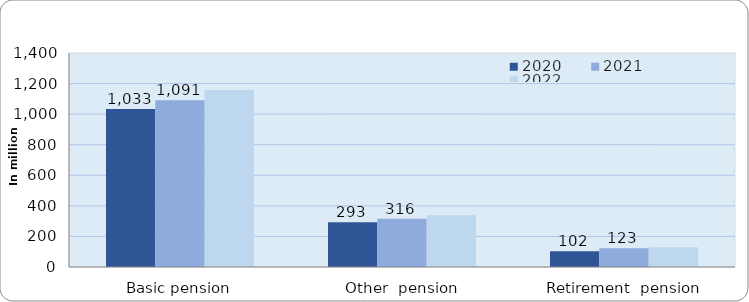
| Category | 2020 | 2021 | 2022 |
|---|---|---|---|
| Basic pension | 1033.207 | 1091.327 | 1157.136 |
| Other  pension | 292.839 | 315.64 | 337.855 |
| Retirement  pension | 102.481 | 123.388 | 128.54 |